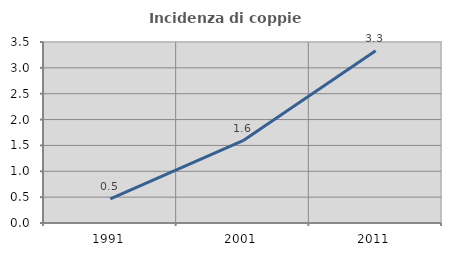
| Category | Incidenza di coppie miste |
|---|---|
| 1991.0 | 0.466 |
| 2001.0 | 1.591 |
| 2011.0 | 3.33 |